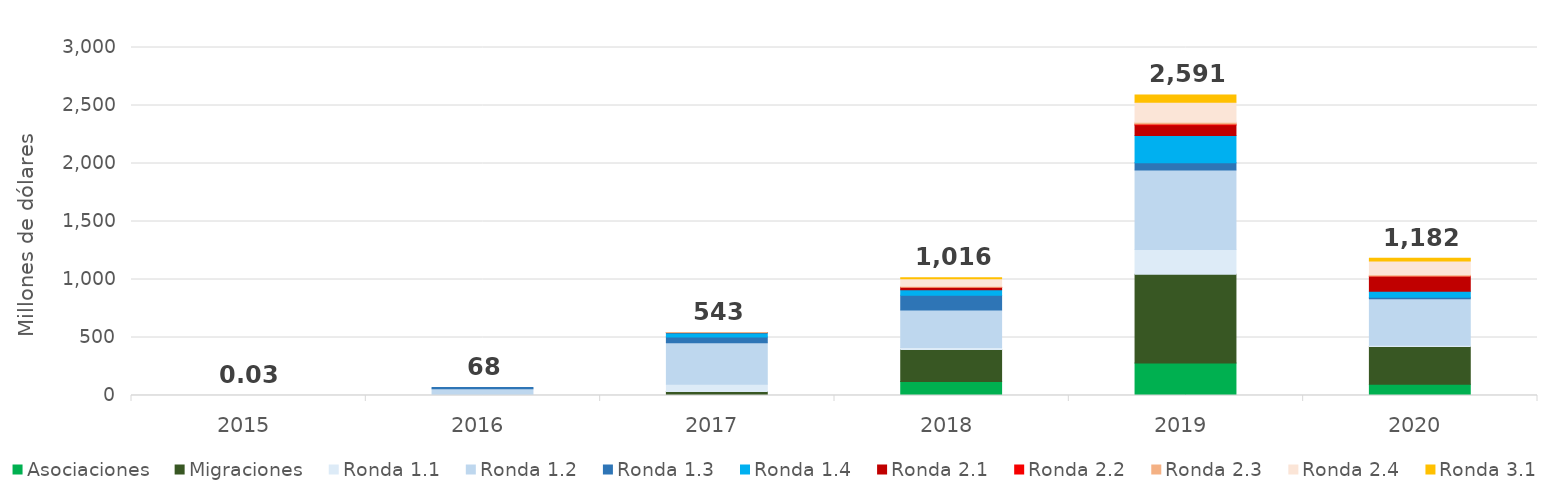
| Category | Asociaciones | Migraciones | Ronda 1.1 | Ronda 1.2 | Ronda 1.3 | Ronda 1.4 | Ronda 2.1 | Ronda 2.2 | Ronda 2.3 | Ronda 2.4 | Ronda 3.1 |
|---|---|---|---|---|---|---|---|---|---|---|---|
| 2015.0 | 0 | 0 | 0.023 | 0.003 | 0 | 0 | 0 | 0 | 0 | 0 | 0 |
| 2016.0 | 0 | 0 | 7.936 | 50.96 | 9.383 | 0 | 0 | 0 | 0 | 0 | 0 |
| 2017.0 | 1.551 | 32.998 | 63.439 | 356.496 | 49.351 | 37.753 | 0.932 | 0 | 0.096 | 0 | 0 |
| 2018.0 | 121.371 | 276.223 | 16.154 | 323.507 | 126.572 | 47.756 | 21.608 | 0.684 | 6.898 | 66.161 | 8.673 |
| 2019.0 | 280.617 | 765.499 | 213.487 | 685.11 | 61.761 | 235.684 | 88.723 | 9.185 | 14.473 | 173.042 | 63.276 |
| 2020.0 | 96.496 | 325.068 | 12.179 | 401.067 | 12.203 | 51.639 | 130.401 | 1.401 | 11.028 | 118.086 | 22.751 |